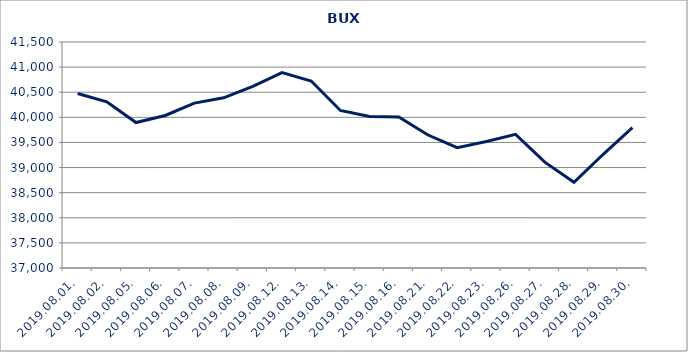
| Category | Series 0 |
|---|---|
| 2019.08.01. | 40474.269 |
| 2019.08.02. | 40309.612 |
| 2019.08.05. | 39896.309 |
| 2019.08.06. | 40037.387 |
| 2019.08.07. | 40283.521 |
| 2019.08.08. | 40389.377 |
| 2019.08.09. | 40615.424 |
| 2019.08.12. | 40891.991 |
| 2019.08.13. | 40722.358 |
| 2019.08.14. | 40137.225 |
| 2019.08.15. | 40018.668 |
| 2019.08.16. | 40005.898 |
| 2019.08.21. | 39648.209 |
| 2019.08.22. | 39394.712 |
| 2019.08.23. | 39519.583 |
| 2019.08.26. | 39661.467 |
| 2019.08.27. | 39107.942 |
| 2019.08.28. | 38706.562 |
| 2019.08.29. | 39264.477 |
| 2019.08.30. | 39794.118 |